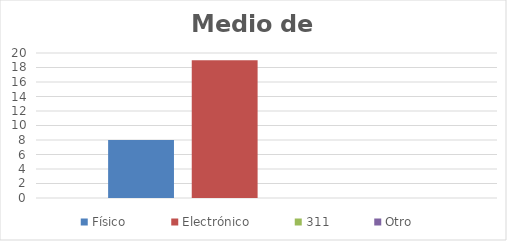
| Category | Físico | Electrónico | 311 | Otro |
|---|---|---|---|---|
| 0 | 8 | 19 | 0 | 0 |